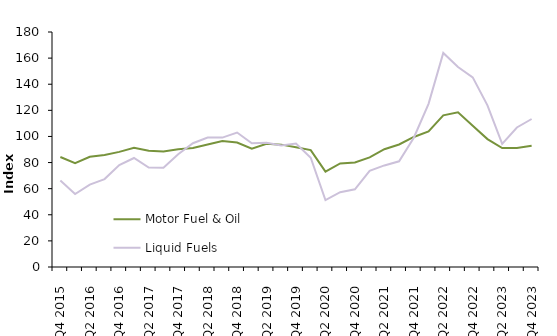
| Category | Motor Fuel & Oil | Liquid Fuels |
|---|---|---|
| Q4 2015 | 84.226 | 66.229 |
| Q1 2016 | 79.583 | 55.844 |
| Q2 2016 | 84.466 | 63.127 |
| Q3 2016 | 85.819 | 67.331 |
| Q4 2016 | 88.193 | 78.144 |
| Q1 2017 | 91.399 | 83.508 |
| Q2 2017 | 89.012 | 76.202 |
| Q3 2017 | 88.493 | 76.05 |
| Q4 2017 | 90.202 | 86.405 |
| Q1 2018 | 91.195 | 94.814 |
| Q2 2018 | 93.898 | 99.179 |
| Q3 2018 | 96.5 | 99.102 |
| Q4 2018 | 95.389 | 102.971 |
| Q1 2019 | 90.59 | 94.736 |
| Q2 2019 | 94.365 | 95.239 |
| Q3 2019 | 93.732 | 93.16 |
| Q4 2019 | 91.798 | 94.617 |
| Q1 2020 | 89.535 | 83.729 |
| Q2 2020 | 73.093 | 51.246 |
| Q3 2020 | 79.348 | 57.272 |
| Q4 2020 | 80.041 | 59.496 |
| Q1 2021 | 83.922 | 73.637 |
| Q2 2021 | 90.248 | 77.806 |
| Q3 2021 | 93.861 | 80.966 |
| Q4 2021 | 99.607 | 98.995 |
| Q1 2022 | 103.852 | 124.967 |
| Q2 2022 | 116.173 | 163.975 |
| Q3 2022 | 118.512 | 153.15 |
| Q4 2022 | 108.187 | 145.278 |
| Q1 2023 | 97.987 | 123.771 |
| Q2 2023 | 91.061 | 94.288 |
| Q3 2023 | 91.188 | 106.864 |
| Q4 2023 | 92.88 | 113.356 |